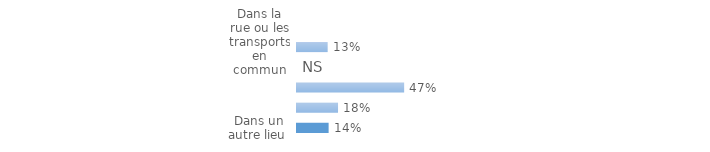
| Category | Series 0 |
|---|---|
| Dans la rue ou les transports en commun | 0.134 |
| Sur le lieu de travail ou d'études  | 0 |
| Au domicile ou dans l'immeuble de la victime | 0.47 |
| Au domicile d'une autre personne | 0.18 |
| Dans un autre lieu  | 0.139 |